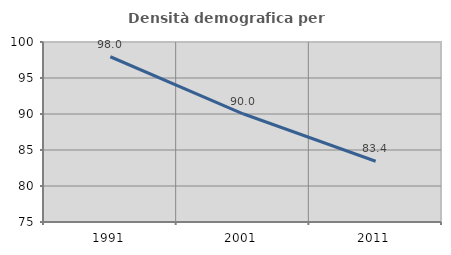
| Category | Densità demografica |
|---|---|
| 1991.0 | 97.951 |
| 2001.0 | 90.032 |
| 2011.0 | 83.442 |